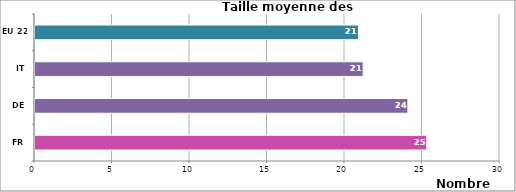
| Category | Series 0 |
|---|---|
| FR | 25.272 |
| DE | 24.056 |
| IT | 21.171 |
| EU 22 | 20.869 |